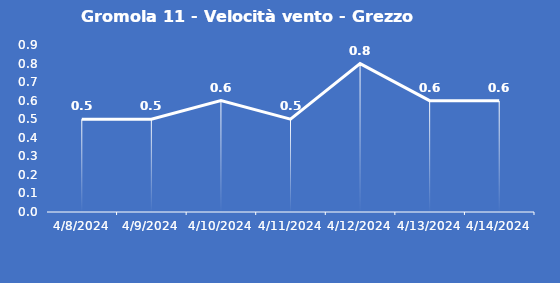
| Category | Gromola 11 - Velocità vento - Grezzo (m/s) |
|---|---|
| 4/8/24 | 0.5 |
| 4/9/24 | 0.5 |
| 4/10/24 | 0.6 |
| 4/11/24 | 0.5 |
| 4/12/24 | 0.8 |
| 4/13/24 | 0.6 |
| 4/14/24 | 0.6 |